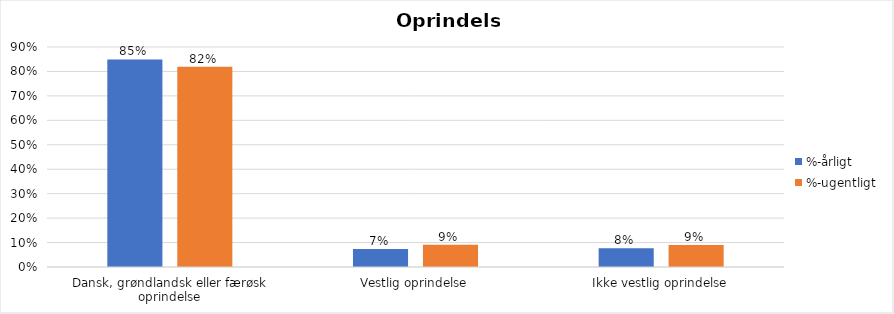
| Category | %-årligt | %-ugentligt |
|---|---|---|
| Dansk, grøndlandsk eller færøsk oprindelse | 0.849 | 0.819 |
| Vestlig oprindelse | 0.074 | 0.091 |
| Ikke vestlig oprindelse | 0.077 | 0.09 |